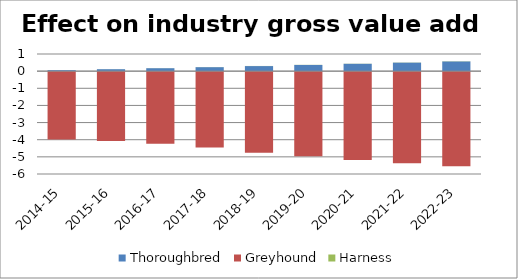
| Category | Thoroughbred | Greyhound | Harness |
|---|---|---|---|
| 2014-15 | 0.057 | -3.981 | 0.001 |
| 2015-16 | 0.114 | -4.069 | 0.002 |
| 2016-17 | 0.172 | -4.233 | 0.004 |
| 2017-18 | 0.233 | -4.455 | 0.005 |
| 2018-19 | 0.296 | -4.754 | 0.006 |
| 2019-20 | 0.362 | -4.971 | 0.007 |
| 2020-21 | 0.429 | -5.184 | 0.008 |
| 2021-22 | 0.498 | -5.373 | 0.009 |
| 2022-23 | 0.568 | -5.553 | 0.01 |